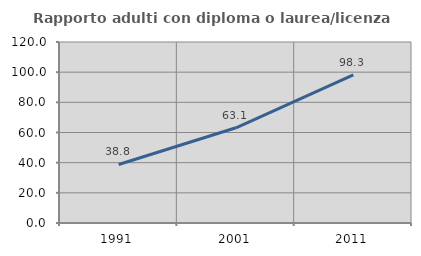
| Category | Rapporto adulti con diploma o laurea/licenza media  |
|---|---|
| 1991.0 | 38.786 |
| 2001.0 | 63.129 |
| 2011.0 | 98.252 |